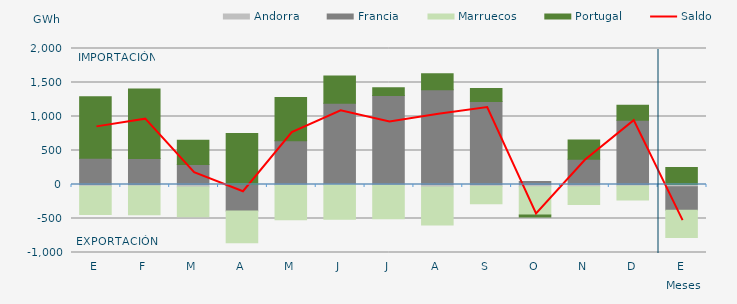
| Category | Andorra | Francia | Marruecos | Portugal |
|---|---|---|---|---|
| E | -25.987 | 385.795 | -415.124 | 902.906 |
| F | -23.582 | 382.97 | -419.717 | 1020.798 |
| M | -38.291 | 293.119 | -437.17 | 357.299 |
| A | -10.01 | -380.068 | -467.659 | 751.052 |
| M | -9.513 | 644.089 | -508.988 | 636.914 |
| J | -6.669 | 1193.686 | -504.732 | 400.985 |
| J | -12.627 | 1308.527 | -490.98 | 112.811 |
| A | -37.63 | 1392.44 | -557.959 | 237.805 |
| S | -26.649 | 1220.635 | -256.297 | 192.901 |
| O | -32.136 | 45.38 | -416.36 | -30.662 |
| N | -34.367 | 370.163 | -261.548 | 282.964 |
| D | -20.819 | 944.738 | -205.475 | 220.278 |
| E | -31.968 | -346.397 | -401.761 | 249.599 |